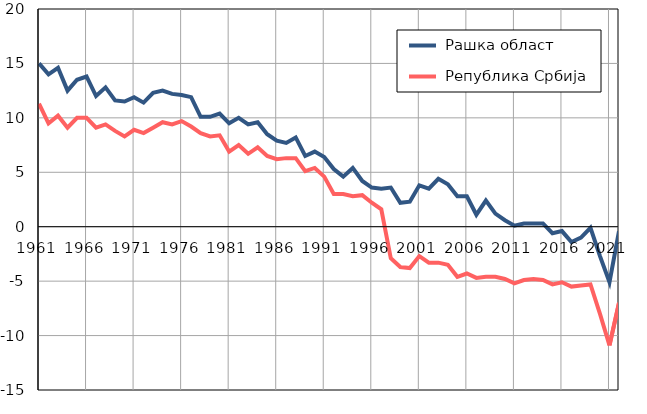
| Category |  Рашка област |  Република Србија |
|---|---|---|
| 1961.0 | 15 | 11.3 |
| 1962.0 | 14 | 9.5 |
| 1963.0 | 14.6 | 10.2 |
| 1964.0 | 12.5 | 9.1 |
| 1965.0 | 13.5 | 10 |
| 1966.0 | 13.8 | 10 |
| 1967.0 | 12 | 9.1 |
| 1968.0 | 12.8 | 9.4 |
| 1969.0 | 11.6 | 8.8 |
| 1970.0 | 11.5 | 8.3 |
| 1971.0 | 11.9 | 8.9 |
| 1972.0 | 11.4 | 8.6 |
| 1973.0 | 12.3 | 9.1 |
| 1974.0 | 12.5 | 9.6 |
| 1975.0 | 12.2 | 9.4 |
| 1976.0 | 12.1 | 9.7 |
| 1977.0 | 11.9 | 9.2 |
| 1978.0 | 10.1 | 8.6 |
| 1979.0 | 10.1 | 8.3 |
| 1980.0 | 10.4 | 8.4 |
| 1981.0 | 9.5 | 6.9 |
| 1982.0 | 10 | 7.5 |
| 1983.0 | 9.4 | 6.7 |
| 1984.0 | 9.6 | 7.3 |
| 1985.0 | 8.5 | 6.5 |
| 1986.0 | 7.9 | 6.2 |
| 1987.0 | 7.7 | 6.3 |
| 1988.0 | 8.2 | 6.3 |
| 1989.0 | 6.5 | 5.1 |
| 1990.0 | 6.9 | 5.4 |
| 1991.0 | 6.4 | 4.6 |
| 1992.0 | 5.3 | 3 |
| 1993.0 | 4.6 | 3 |
| 1994.0 | 5.4 | 2.8 |
| 1995.0 | 4.2 | 2.9 |
| 1996.0 | 3.6 | 2.2 |
| 1997.0 | 3.5 | 1.6 |
| 1998.0 | 3.6 | -2.9 |
| 1999.0 | 2.2 | -3.7 |
| 2000.0 | 2.3 | -3.8 |
| 2001.0 | 3.8 | -2.7 |
| 2002.0 | 3.5 | -3.3 |
| 2003.0 | 4.4 | -3.3 |
| 2004.0 | 3.9 | -3.5 |
| 2005.0 | 2.8 | -4.6 |
| 2006.0 | 2.8 | -4.3 |
| 2007.0 | 1.1 | -4.7 |
| 2008.0 | 2.4 | -4.6 |
| 2009.0 | 1.2 | -4.6 |
| 2010.0 | 0.6 | -4.8 |
| 2011.0 | 0.1 | -5.2 |
| 2012.0 | 0.3 | -4.9 |
| 2013.0 | 0.3 | -4.8 |
| 2014.0 | 0.3 | -4.9 |
| 2015.0 | -0.6 | -5.3 |
| 2016.0 | -0.4 | -5.1 |
| 2017.0 | -1.4 | -5.5 |
| 2018.0 | -1 | -5.4 |
| 2019.0 | -0.1 | -5.3 |
| 2020.0 | -2.7 | -8 |
| 2021.0 | -5.1 | -10.9 |
| 2022.0 | -0.4 | -7 |